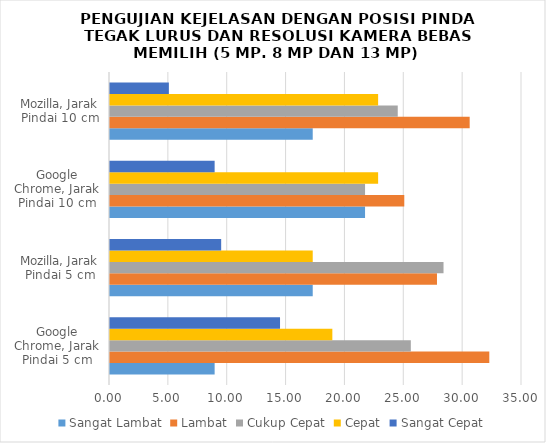
| Category | Sangat Lambat | Lambat | Cukup Cepat | Cepat | Sangat Cepat |
|---|---|---|---|---|---|
| Google Chrome, Jarak Pindai 5 cm | 8.889 | 32.222 | 25.556 | 18.889 | 14.444 |
| Mozilla, Jarak Pindai 5 cm | 17.222 | 27.778 | 28.333 | 17.222 | 9.444 |
| Google Chrome, Jarak Pindai 10 cm | 21.667 | 25 | 21.667 | 22.778 | 8.889 |
| Mozilla, Jarak Pindai 10 cm | 17.222 | 30.556 | 24.444 | 22.778 | 5 |